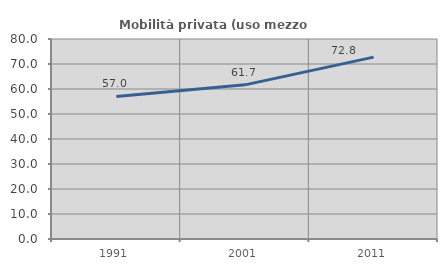
| Category | Mobilità privata (uso mezzo privato) |
|---|---|
| 1991.0 | 57.005 |
| 2001.0 | 61.657 |
| 2011.0 | 72.752 |